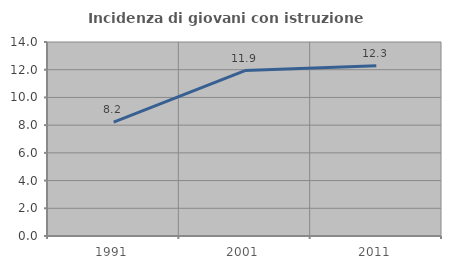
| Category | Incidenza di giovani con istruzione universitaria |
|---|---|
| 1991.0 | 8.219 |
| 2001.0 | 11.94 |
| 2011.0 | 12.281 |